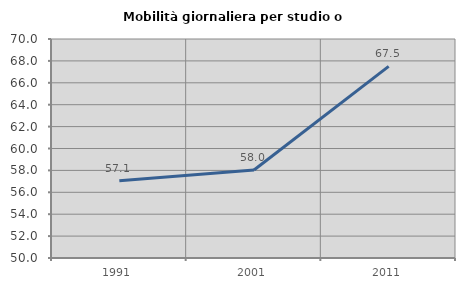
| Category | Mobilità giornaliera per studio o lavoro |
|---|---|
| 1991.0 | 57.054 |
| 2001.0 | 58.04 |
| 2011.0 | 67.503 |